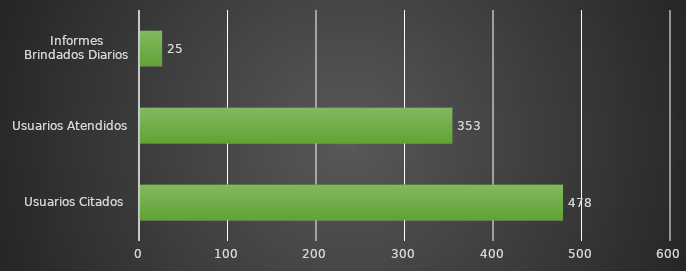
| Category | INDICADOR  |
|---|---|
| Usuarios Citados  | 478 |
| Usuarios Atendidos | 353 |
| Informes Brindados Diarios | 25 |